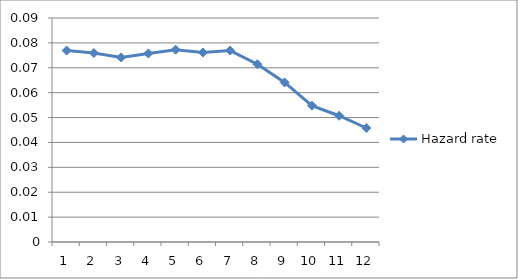
| Category | Hazard rate |
|---|---|
| 0 | 0.077 |
| 1 | 0.076 |
| 2 | 0.074 |
| 3 | 0.076 |
| 4 | 0.077 |
| 5 | 0.076 |
| 6 | 0.077 |
| 7 | 0.071 |
| 8 | 0.064 |
| 9 | 0.055 |
| 10 | 0.051 |
| 11 | 0.046 |